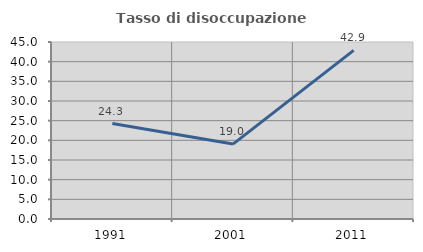
| Category | Tasso di disoccupazione giovanile  |
|---|---|
| 1991.0 | 24.272 |
| 2001.0 | 19.048 |
| 2011.0 | 42.857 |